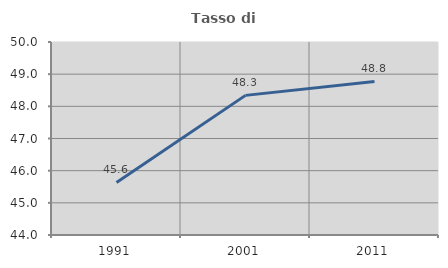
| Category | Tasso di occupazione   |
|---|---|
| 1991.0 | 45.634 |
| 2001.0 | 48.341 |
| 2011.0 | 48.773 |